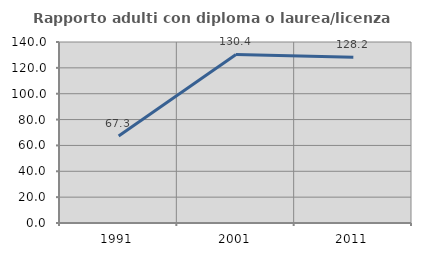
| Category | Rapporto adulti con diploma o laurea/licenza media  |
|---|---|
| 1991.0 | 67.327 |
| 2001.0 | 130.396 |
| 2011.0 | 128.223 |